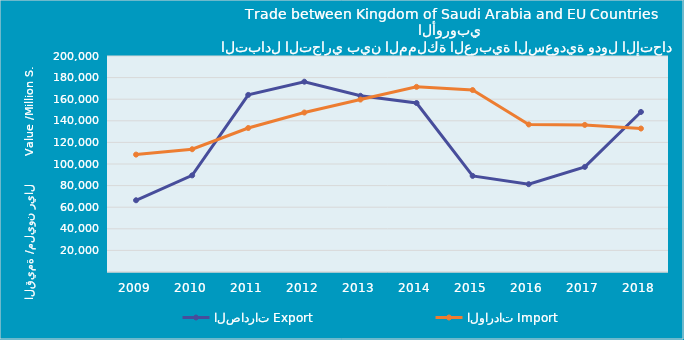
| Category | الصادرات | الواردات |
|---|---|---|
| 2009.0 | 66424449943 | 108706870724 |
| 2010.0 | 89473272822 | 113673694057 |
| 2011.0 | 163984710171 | 133338217916 |
| 2012.0 | 176214374025 | 147655229181 |
| 2013.0 | 163153758917 | 159668962902 |
| 2014.0 | 156468256094 | 171440173149 |
| 2015.0 | 88997074905 | 168482820598 |
| 2016.0 | 81310614558 | 136611121499 |
| 2017.0 | 97297815008 | 136211429633 |
| 2018.0 | 148179878985 | 132846368857 |